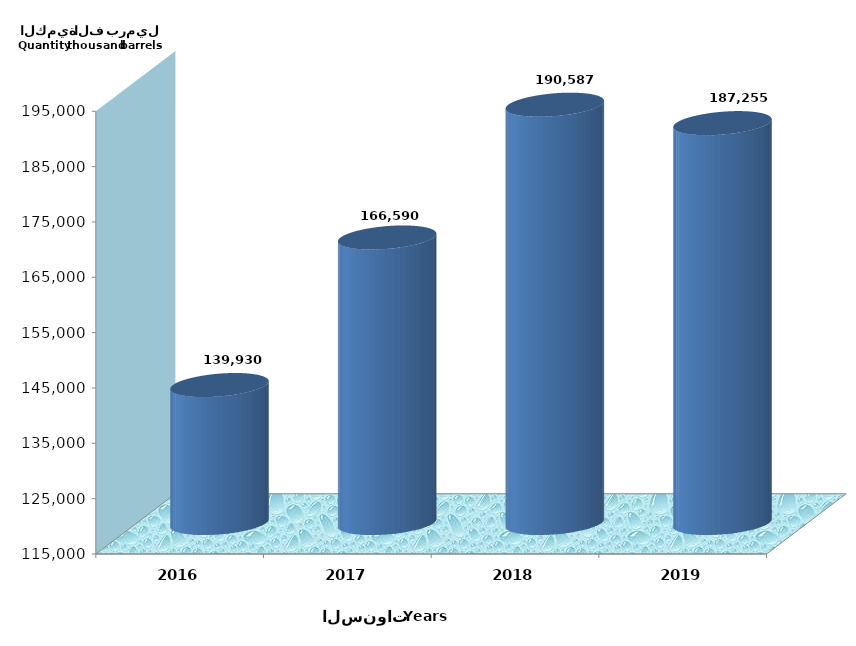
| Category | Series 0 |
|---|---|
| 2016 | 139929733 |
| 2017 | 166590059.344 |
| 2018 | 190586727.136 |
| 2019 | 187255134.955 |